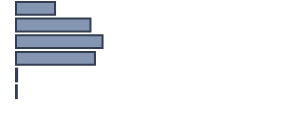
| Category | Series 0 |
|---|---|
| 0 | 13.9 |
| 1 | 26.5 |
| 2 | 30.8 |
| 3 | 28.1 |
| 4 | 0.4 |
| 5 | 0.3 |